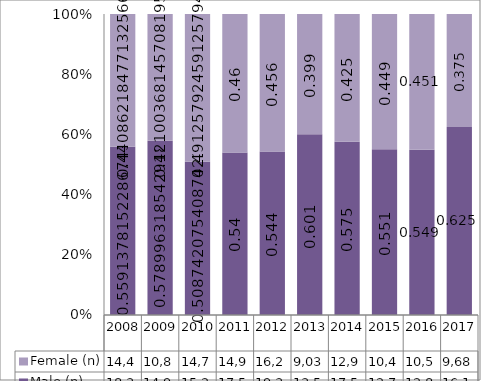
| Category | Male (n) | Female (n) |
|---|---|---|
| 2008.0 | 18314 | 14440 |
| 2009.0 | 14941 | 10864 |
| 2010.0 | 15247 | 14723 |
| 2011.0 | 17580 | 14982 |
| 2012.0 | 19368 | 16262 |
| 2013.0 | 13581 | 9033 |
| 2014.0 | 17582 | 12978 |
| 2015.0 | 12766 | 10418 |
| 2016.0 | 12892 | 10576 |
| 2017.0 | 16137 | 9687 |